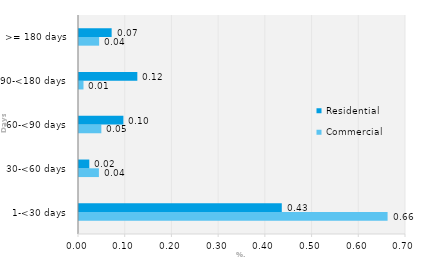
| Category | Commercial | Residential |
|---|---|---|
| 1-<30 days | 0.661 | 0.434 |
| 30-<60 days | 0.043 | 0.022 |
| 60-<90 days | 0.048 | 0.095 |
| 90-<180 days | 0.01 | 0.125 |
| >= 180 days | 0.043 | 0.07 |